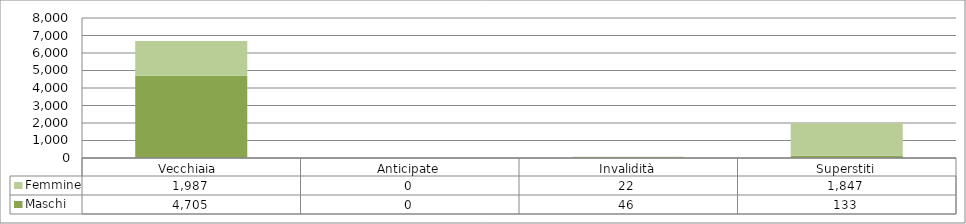
| Category | Maschi | Femmine |
|---|---|---|
| Vecchiaia  | 4705 | 1987 |
| Anticipate | 0 | 0 |
| Invalidità | 46 | 22 |
| Superstiti | 133 | 1847 |